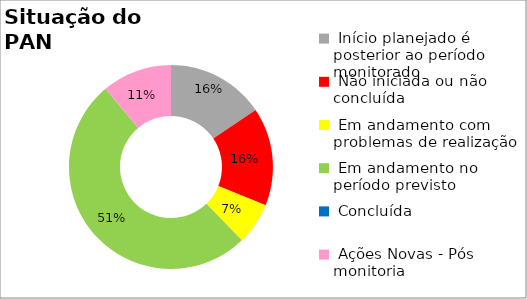
| Category | Series 0 |
|---|---|
|  Início planejado é posterior ao período monitorado | 0.156 |
|  Não iniciada ou não concluída | 0.156 |
|  Em andamento com problemas de realização | 0.067 |
|  Em andamento no período previsto  | 0.511 |
|  Concluída | 0 |
|  Ações Novas - Pós monitoria | 0.111 |